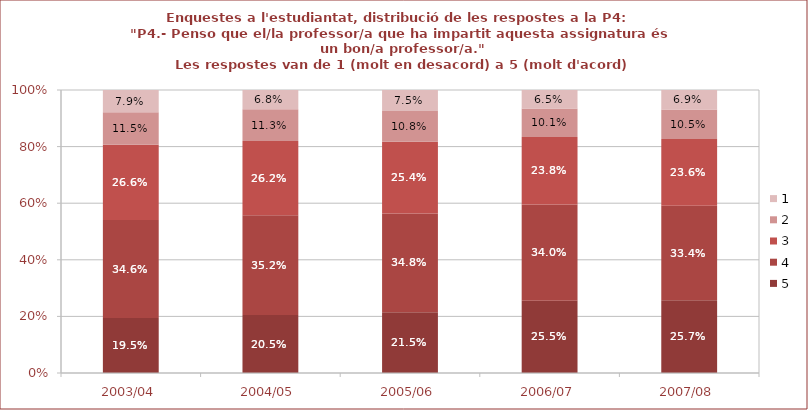
| Category | 5 | 4 | 3 | 2 | 1 |
|---|---|---|---|---|---|
| 2003/04 | 0.195 | 0.346 | 0.266 | 0.115 | 0.079 |
| 2004/05 | 0.205 | 0.352 | 0.262 | 0.113 | 0.068 |
| 2005/06 | 0.215 | 0.348 | 0.254 | 0.108 | 0.075 |
| 2006/07 | 0.255 | 0.34 | 0.238 | 0.101 | 0.065 |
| 2007/08 | 0.257 | 0.334 | 0.236 | 0.105 | 0.069 |